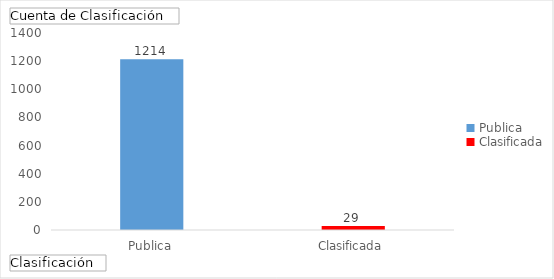
| Category | Total |
|---|---|
| Publica | 1214 |
| Clasificada | 29 |